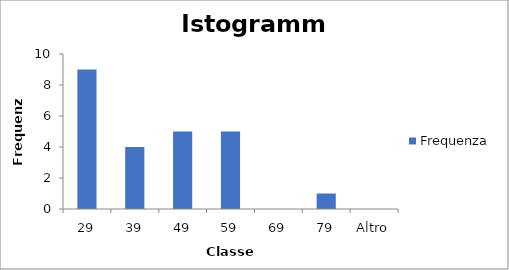
| Category | Frequenza |
|---|---|
| 29 | 9 |
| 39 | 4 |
| 49 | 5 |
| 59 | 5 |
| 69 | 0 |
| 79 | 1 |
| Altro | 0 |